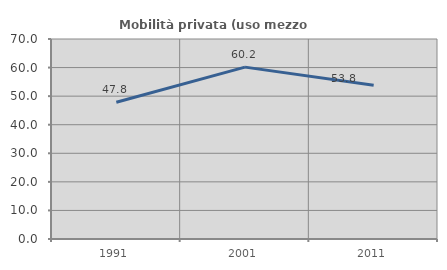
| Category | Mobilità privata (uso mezzo privato) |
|---|---|
| 1991.0 | 47.845 |
| 2001.0 | 60.157 |
| 2011.0 | 53.798 |